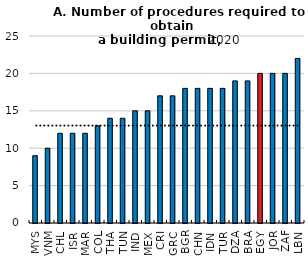
| Category | A: Dealing with construction permits: number of procedures required to obtain a permit |
|---|---|
| MYS | 9 |
| VNM | 10 |
| CHL | 12 |
| ISR | 12 |
| MAR | 12 |
| COL | 13 |
| THA | 14 |
| TUN | 14 |
| IND | 15 |
| MEX | 15 |
| CRI | 17 |
| GRC | 17 |
| BGR | 18 |
| CHN | 18 |
| IDN | 18 |
| TUR | 18 |
| DZA | 19 |
| BRA | 19 |
| EGY | 20 |
| JOR | 20 |
| ZAF | 20 |
| LBN | 22 |